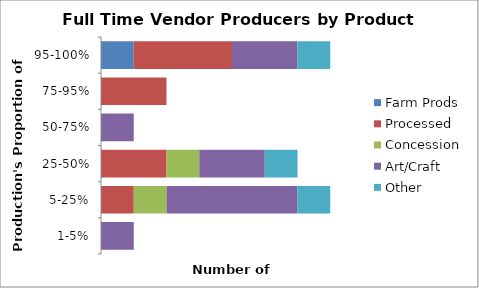
| Category | Farm Prods | Processed | Concession | Art/Craft | Other |
|---|---|---|---|---|---|
| 1-5% | 0 | 0 | 0 | 0.2 | 0 |
| 5-25% | 0 | 0.2 | 0.2 | 0.8 | 0.2 |
| 25-50% | 0 | 0.4 | 0.2 | 0.4 | 0.2 |
| 50-75% | 0 | 0 | 0 | 0.2 | 0 |
| 75-95% | 0 | 0.4 | 0 | 0 | 0 |
| 95-100% | 0.2 | 0.6 | 0 | 0.4 | 0.2 |